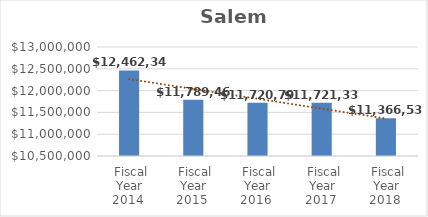
| Category | Salem Campus |
|---|---|
| Fiscal Year 2014 | 12462340 |
| Fiscal Year 2015 | 11789467 |
| Fiscal Year 2016 | 11720791 |
| Fiscal Year 2017 | 11721334 |
| Fiscal Year 2018 | 11366531 |